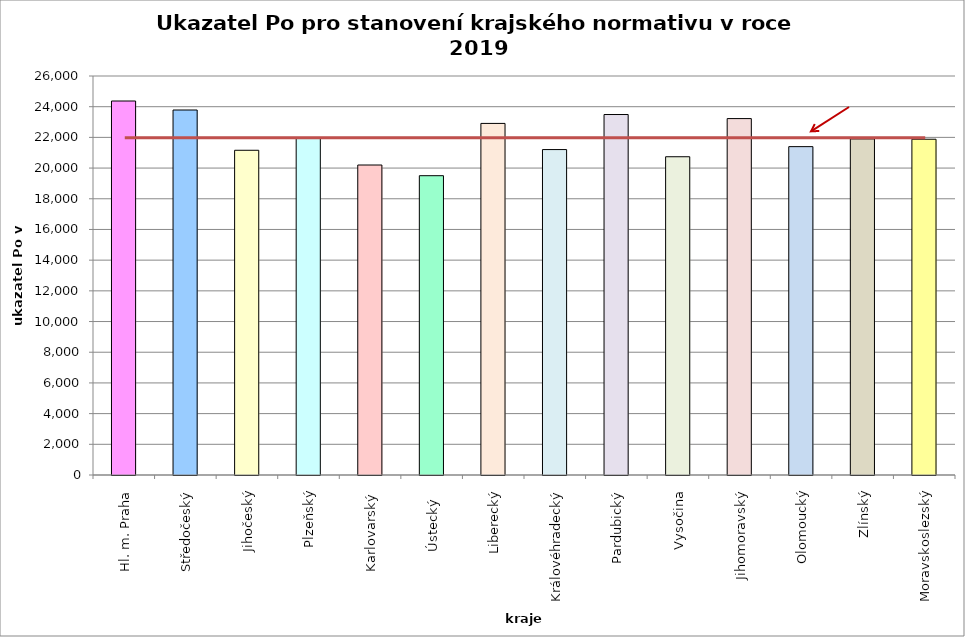
| Category | Series 0 |
|---|---|
| Hl. m. Praha | 24370 |
| Středočeský | 23784 |
| Jihočeský | 21160 |
| Plzeňský | 21960 |
| Karlovarský  | 20200 |
| Ústecký   | 19504 |
| Liberecký | 22910 |
| Královéhradecký | 21206 |
| Pardubický | 23490 |
| Vysočina | 20739 |
| Jihomoravský | 23225 |
| Olomoucký | 21397 |
| Zlínský | 21900 |
| Moravskoslezský | 21880 |